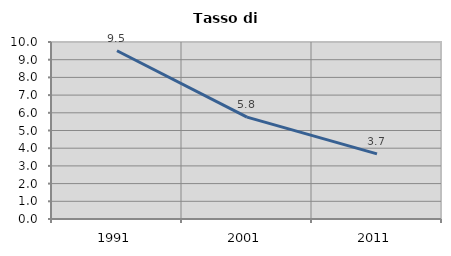
| Category | Tasso di disoccupazione   |
|---|---|
| 1991.0 | 9.506 |
| 2001.0 | 5.755 |
| 2011.0 | 3.676 |